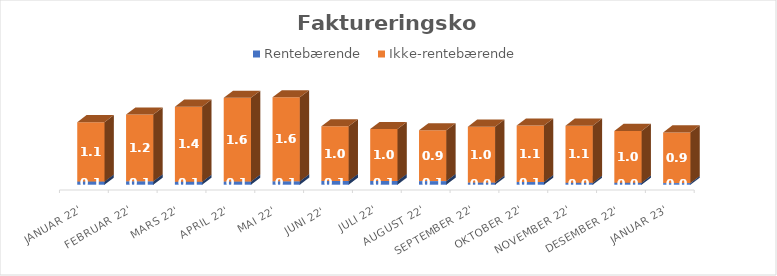
| Category | Rentebærende  | Ikke-rentebærende |
|---|---|---|
| Januar 22' | 0.061 | 1.107 |
| Februar 22' | 0.063 | 1.247 |
| Mars 22' | 0.054 | 1.404 |
| April 22' | 0.058 | 1.565 |
| Mai 22' | 0.063 | 1.572 |
| Juni 22' | 0.069 | 1.024 |
| Juli 22' | 0.07 | 0.97 |
| August 22' | 0.067 | 0.949 |
| September 22' | 0.039 | 1.046 |
| Oktober 22' | 0.05 | 1.056 |
| November 22' | 0.037 | 1.066 |
| Desember 22' | 0.038 | 0.967 |
| Januar 23' | 0.03 | 0.947 |